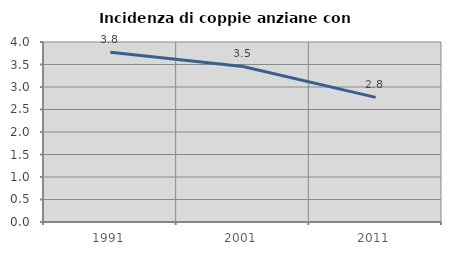
| Category | Incidenza di coppie anziane con figli |
|---|---|
| 1991.0 | 3.774 |
| 2001.0 | 3.457 |
| 2011.0 | 2.769 |